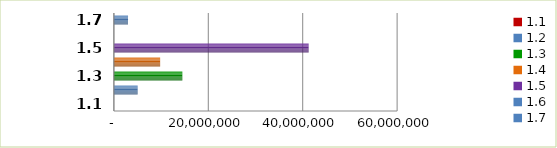
| Category | Series 0 |
|---|---|
| 1.1 | 0 |
| 1.2 | 5035881 |
| 1.3 | 14500000 |
| 1.4 | 9795000 |
| 1.5 | 41259147.99 |
| 1.6 | 0 |
| 1.7 | 3000000 |